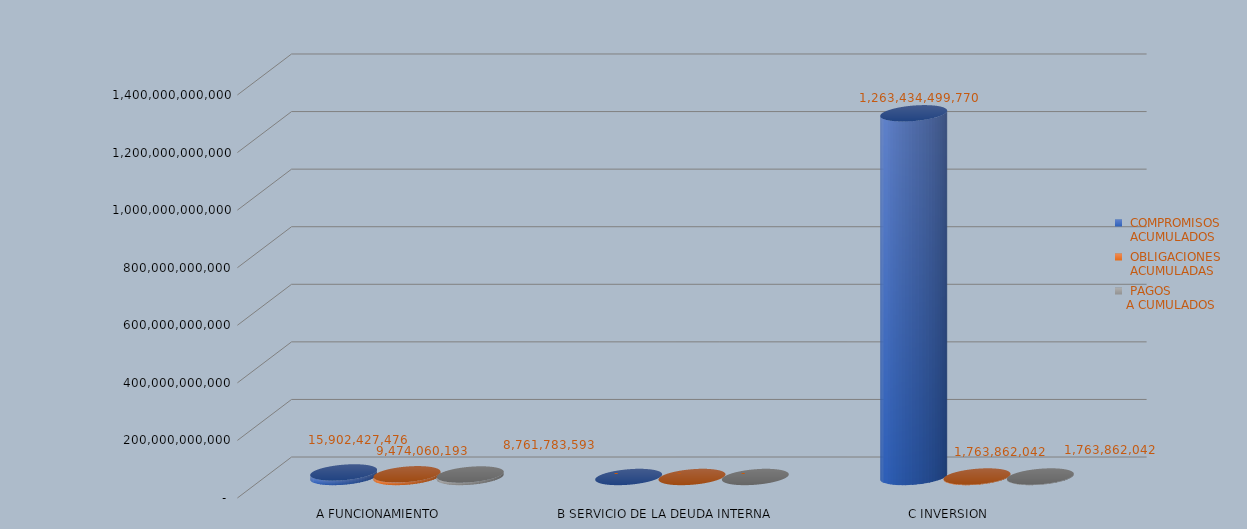
| Category |  COMPROMISOS
 ACUMULADOS |  OBLIGACIONES
 ACUMULADAS |  PAGOS
A CUMULADOS |
|---|---|---|---|
| A FUNCIONAMIENTO | 15902427475.66 | 9474060193.11 | 8761783593.11 |
| B SERVICIO DE LA DEUDA INTERNA | 0 | 0 | 0 |
| C INVERSION | 1263434499770.08 | 1763862042 | 1763862042 |